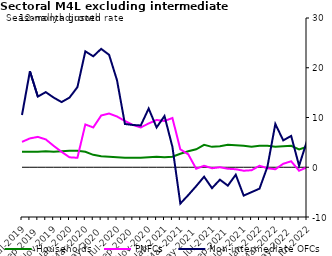
| Category | zero | Households | PNFCs | Non-intermediate OFCs |
|---|---|---|---|---|
| Jul-2019 | 0 | 3.1 | 5.1 | 10.5 |
| Aug-2019 | 0 | 3.1 | 5.8 | 19.3 |
| Sep-2019 | 0 | 3.1 | 6.1 | 14.2 |
| Oct-2019 | 0 | 3.2 | 5.6 | 15.1 |
| Nov-2019 | 0 | 3.1 | 4.3 | 14 |
| Dec-2019 | 0 | 3.2 | 3.1 | 13.1 |
| Jan-2020 | 0 | 3.3 | 2 | 14 |
| Feb-2020 | 0 | 3.3 | 1.9 | 16.1 |
| Mar-2020 | 0 | 3.1 | 8.6 | 23.3 |
| Apr-2020 | 0 | 2.5 | 8 | 22.3 |
| May-2020 | 0 | 2.2 | 10.4 | 23.8 |
| Jun-2020 | 0 | 2.1 | 10.8 | 22.6 |
| Jul-2020 | 0 | 2 | 10.2 | 17.5 |
| Aug-2020 | 0 | 1.9 | 9.3 | 8.7 |
| Sep-2020 | 0 | 1.9 | 8.5 | 8.5 |
| Oct-2020 | 0 | 1.9 | 8 | 8.4 |
| Nov-2020 | 0 | 2 | 8.8 | 11.8 |
| Dec-2020 | 0 | 2.1 | 9.5 | 8 |
| Jan-2021 | 0 | 2 | 9.3 | 10.3 |
| Feb-2021 | 0 | 2.1 | 9.9 | 4.1 |
| Mar-2021 | 0 | 2.7 | 3.6 | -7.3 |
| Apr-2021 | 0 | 3.2 | 2.6 | -5.6 |
| May-2021 | 0 | 3.6 | -0.3 | -3.8 |
| Jun-2021 | 0 | 4.5 | 0.3 | -1.9 |
| Jul-2021 | 0 | 4.1 | -0.2 | -4.2 |
| Aug-2021 | 0 | 4.2 | 0 | -2.5 |
| Sep-2021 | 0 | 4.5 | -0.3 | -3.7 |
| Oct-2021 | 0 | 4.4 | -0.4 | -1.5 |
| Nov-2021 | 0 | 4.3 | -0.7 | -5.7 |
| Dec-2021 | 0 | 4.1 | -0.6 | -5 |
| Jan-2022 | 0 | 4.3 | 0.3 | -4.3 |
| Feb-2022 | 0 | 4.3 | -0.2 | 0.1 |
| Mar-2022 | 0 | 4.1 | -0.4 | 8.7 |
| Apr-2022 | 0 | 4.2 | 0.7 | 5.4 |
| May-2022 | 0 | 4.3 | 1.2 | 6.3 |
| Jun-2022 | 0 | 3.6 | -0.7 | 0.3 |
| Jul-2022 | 0 | 4.1 | 0 | 5.3 |